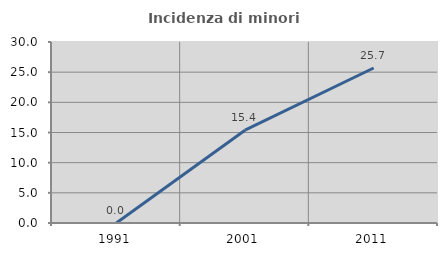
| Category | Incidenza di minori stranieri |
|---|---|
| 1991.0 | 0 |
| 2001.0 | 15.385 |
| 2011.0 | 25.688 |